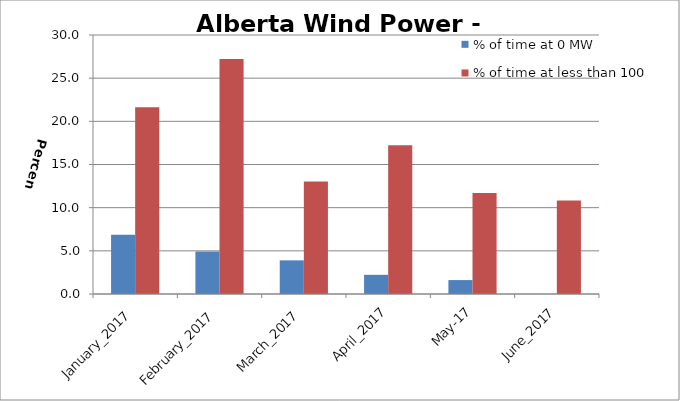
| Category | % of time at 0 MW | % of time at less than 100 MW |
|---|---|---|
| January_2017 | 6.855 | 21.64 |
| February_2017 | 4.911 | 27.232 |
| March_2017 | 3.898 | 13.038 |
| April_2017 | 2.222 | 17.222 |
| May-17 | 1.613 | 11.694 |
| June_2017 | 0 | 10.833 |